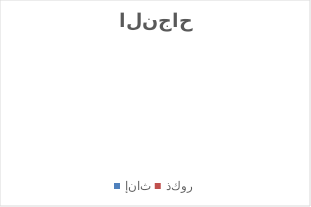
| Category | >=10 |
|---|---|
| إناث | 0 |
| ذكور | 0 |